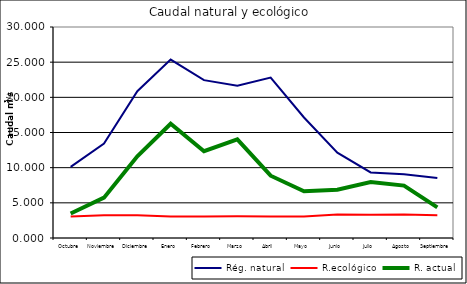
| Category | Rég. natural | R.ecológico | R. actual |
|---|---|---|---|
| Octubre | 10.117 | 3.07 | 3.491 |
| Noviembre | 13.443 | 3.25 | 5.736 |
| Diciembre | 20.864 | 3.25 | 11.62 |
| Enero | 25.372 | 3.07 | 16.25 |
| Febrero | 22.443 | 3.07 | 12.343 |
| Marzo | 21.641 | 3.08 | 14.022 |
| Abril | 22.81 | 3.07 | 8.86 |
| Mayo | 17.135 | 3.07 | 6.64 |
| Junio | 12.134 | 3.35 | 6.864 |
| Julio | 9.327 | 3.3 | 7.952 |
| Agosto | 9.051 | 3.33 | 7.454 |
| Septiembre | 8.535 | 3.25 | 4.357 |